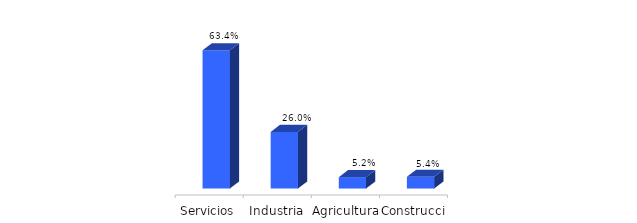
| Category | La Rioja |
|---|---|
| Servicios | 0.634 |
| Industria | 0.26 |
| Agricultura | 0.052 |
| Construcción | 0.054 |